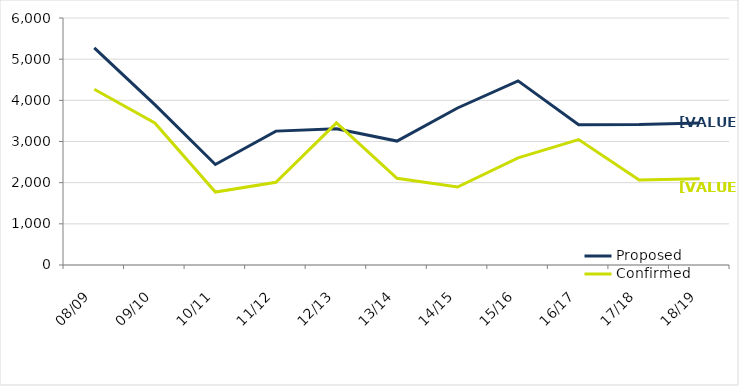
| Category | Proposed | Confirmed |
|---|---|---|
| 08/09 | 5274 | 4269 |
| 09/10 | 3896 | 3449 |
| 10/11 | 2442 | 1772 |
| 11/12 | 3252 | 2008 |
| 12/13 | 3308 | 3452 |
| 13/14 | 3011 | 2105 |
| 14/15 | 3814 | 1893 |
| 15/16 | 4473 | 2603 |
| 16/17 | 3408 | 3047 |
| 17/18 | 3411 | 2067 |
| 18/19 | 3452 | 2098 |